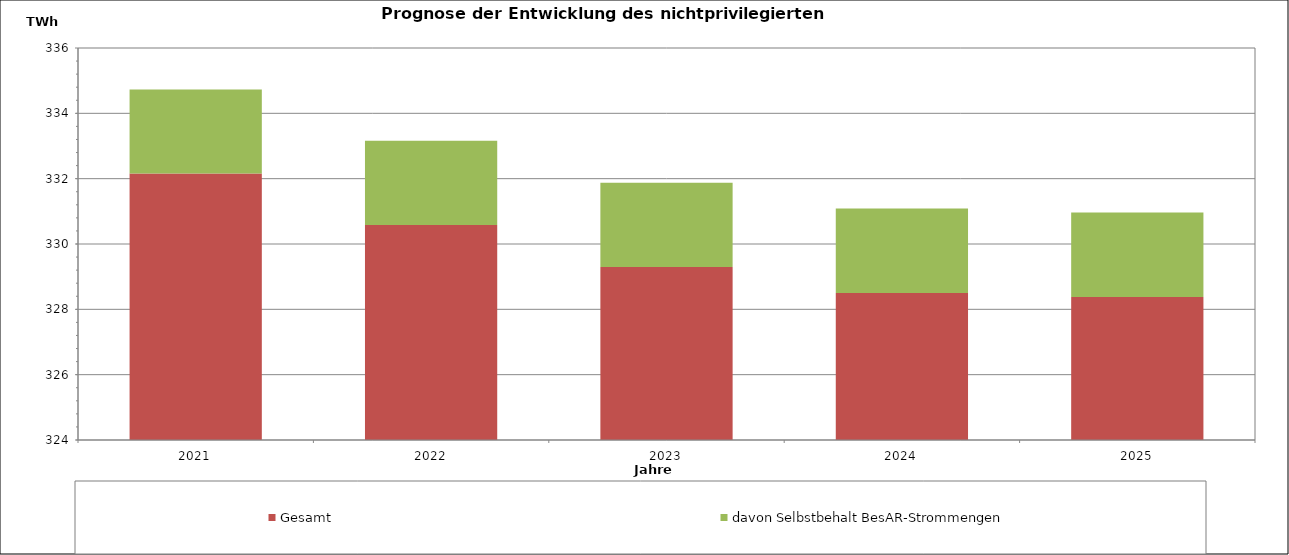
| Category | Gesamt | davon Selbstbehalt BesAR-Strommengen |
|---|---|---|
| 2021.0 | 332.155 | 2.575 |
| 2022.0 | 330.585 | 2.579 |
| 2023.0 | 329.294 | 2.583 |
| 2024.0 | 328.502 | 2.587 |
| 2025.0 | 328.375 | 2.591 |